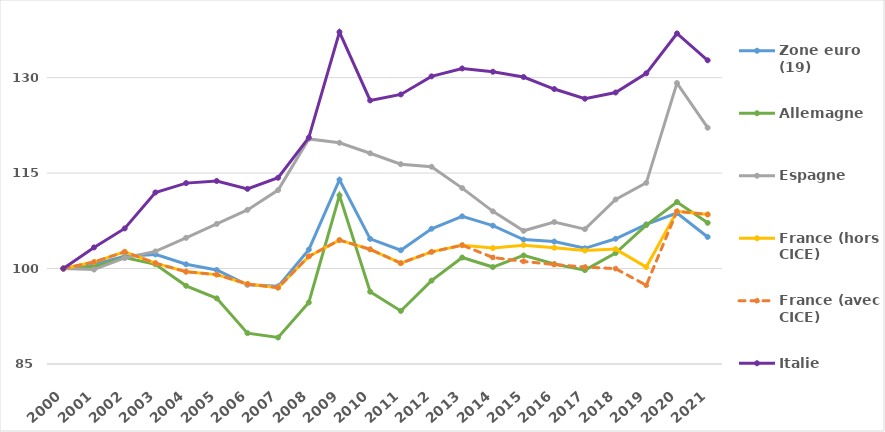
| Category | Zone euro (19) | Allemagne | Espagne | France (hors CICE) | France (avec CICE) | Italie |
|---|---|---|---|---|---|---|
| 2000 | 100 | 100 | 100 | 100 | 100 | 100 |
| 2001 | 100.655 | 100.283 | 99.842 | 101.019 | 101.019 | 103.32 |
| 2002 | 101.934 | 101.721 | 101.671 | 102.626 | 102.626 | 106.305 |
| 2003 | 102.226 | 100.669 | 102.693 | 100.847 | 100.847 | 111.956 |
| 2004 | 100.669 | 97.286 | 104.826 | 99.501 | 99.501 | 113.425 |
| 2005 | 99.769 | 95.318 | 107.008 | 99.046 | 99.046 | 113.759 |
| 2006 | 97.454 | 89.848 | 109.217 | 97.567 | 97.567 | 112.521 |
| 2007 | 97.204 | 89.165 | 112.328 | 96.992 | 96.992 | 114.27 |
| 2008 | 102.968 | 94.669 | 120.369 | 101.91 | 101.91 | 120.582 |
| 2009 | 113.958 | 111.507 | 119.765 | 104.473 | 104.473 | 137.163 |
| 2010 | 104.658 | 96.359 | 118.112 | 103.017 | 103.017 | 126.418 |
| 2011 | 102.877 | 93.333 | 116.401 | 100.843 | 100.843 | 127.359 |
| 2012 | 106.252 | 98.1 | 116.001 | 102.619 | 102.619 | 130.202 |
| 2013 | 108.201 | 101.732 | 112.642 | 103.673 | 103.673 | 131.442 |
| 2014 | 106.736 | 100.234 | 108.99 | 103.22 | 101.737 | 130.926 |
| 2015 | 104.551 | 102.062 | 105.93 | 103.674 | 101.124 | 130.101 |
| 2016 | 104.244 | 100.706 | 107.315 | 103.269 | 100.628 | 128.207 |
| 2017 | 103.18 | 99.752 | 106.19 | 102.834 | 100.24 | 126.688 |
| 2018 | 104.681 | 102.423 | 110.853 | 103.055 | 99.981 | 127.665 |
| 2019 | 106.936 | 106.837 | 113.471 | 100.228 | 97.373 | 130.681 |
| 2020 | 108.724 | 110.456 | 129.139 | 108.993 | 108.993 | 136.941 |
| 2021 | 104.965 | 107.184 | 122.13 | 108.494 | 108.494 | 132.723 |